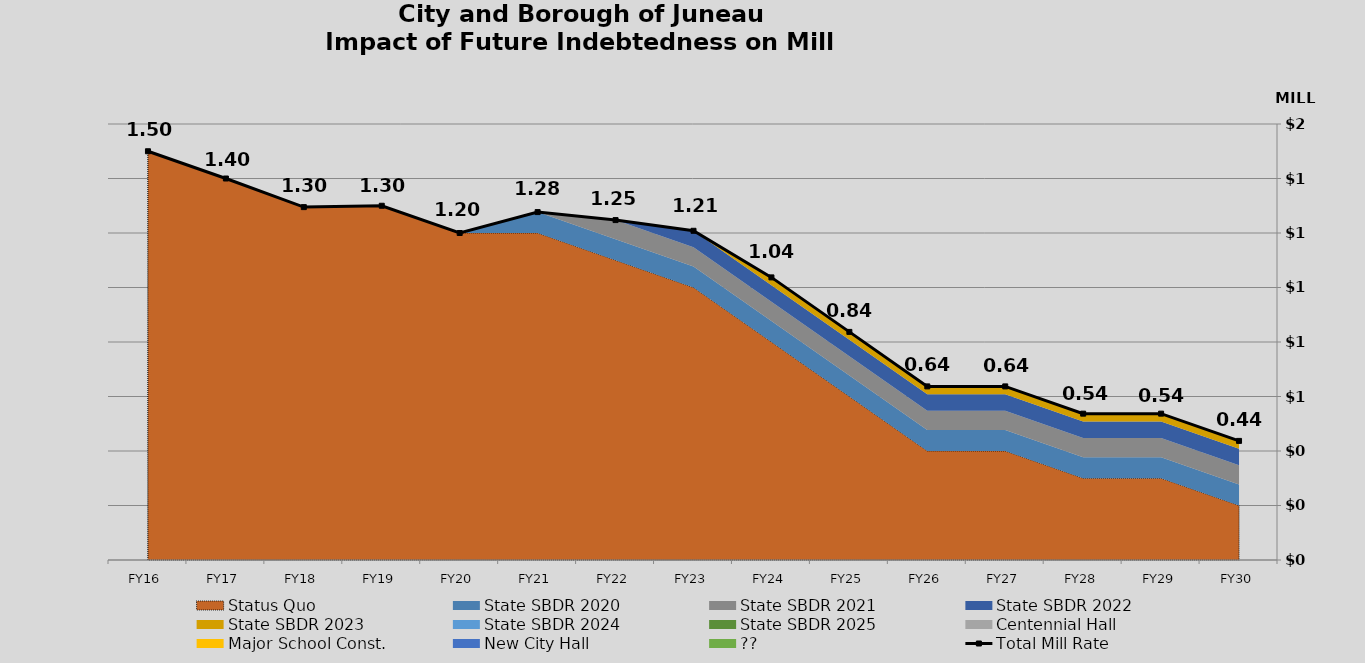
| Category | Total Mill Rate |
|---|---|
| 0 | 1.5 |
| 1 | 1.4 |
| 2 | 1.295 |
| 3 | 1.3 |
| 4 | 1.2 |
| 5 | 1.277 |
| 6 | 1.247 |
| 7 | 1.208 |
| 8 | 1.037 |
| 9 | 0.837 |
| 10 | 0.637 |
| 11 | 0.637 |
| 12 | 0.537 |
| 13 | 0.537 |
| 14 | 0.437 |